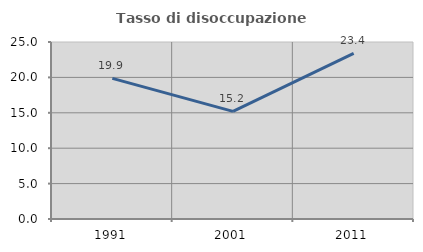
| Category | Tasso di disoccupazione giovanile  |
|---|---|
| 1991.0 | 19.869 |
| 2001.0 | 15.196 |
| 2011.0 | 23.38 |